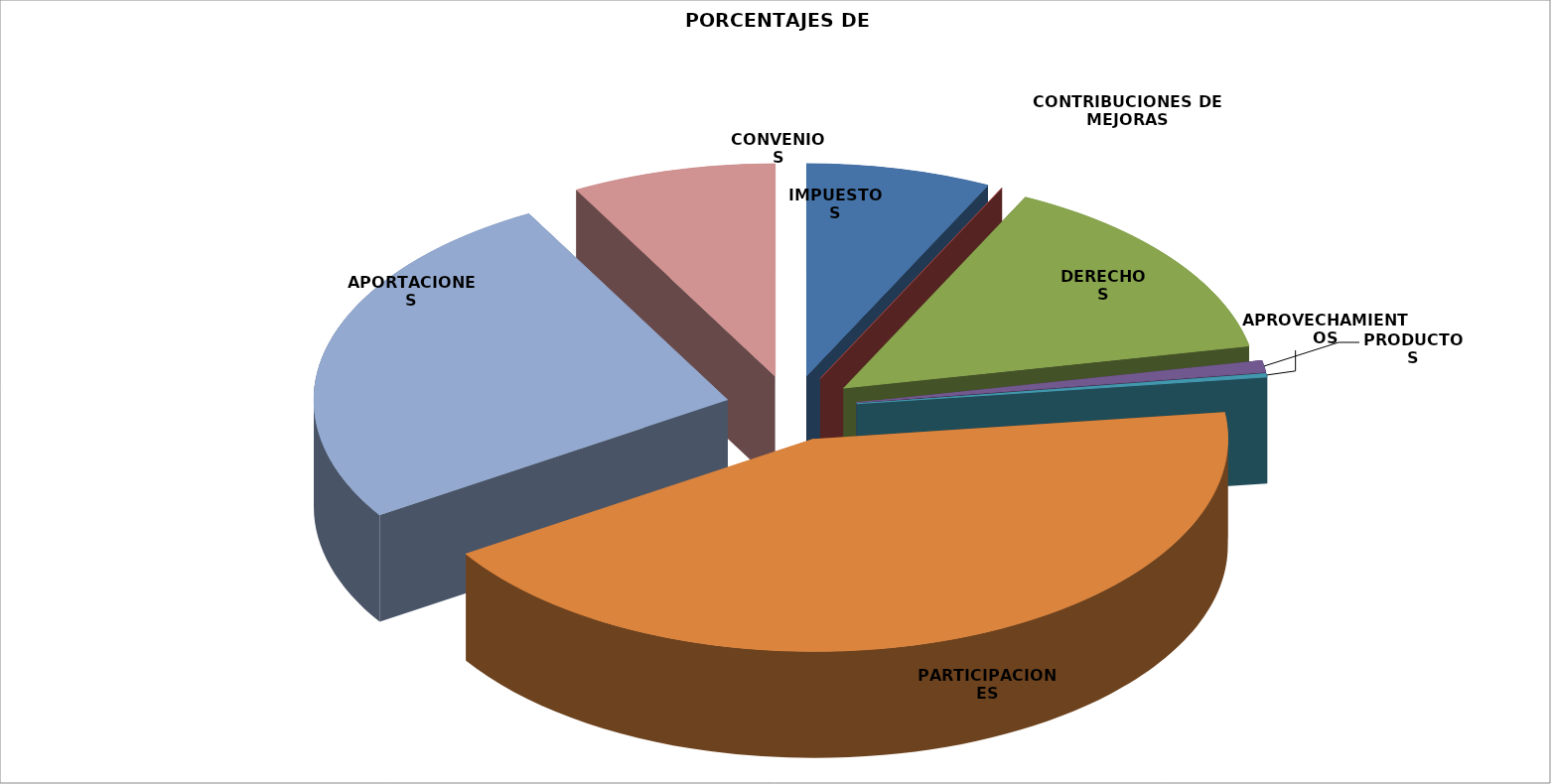
| Category | TOTAL | PORCENTAJE |
|---|---|---|
| IMPUESTOS | 1807606.35 | 0.072 |
| CONTRIBUCIONES DE MEJORAS | 0 | 0 |
| DERECHOS | 3644594.951 | 0.146 |
| PRODUCTOS | 222679.77 | 0.009 |
| APROVECHAMIENTOS | 69679.4 | 0.003 |
| PARTICIPACIONES | 10722858.76 | 0.429 |
| APORTACIONES | 6530135.52 | 0.261 |
| CONVENIOS | 1993041.93 | 0.08 |